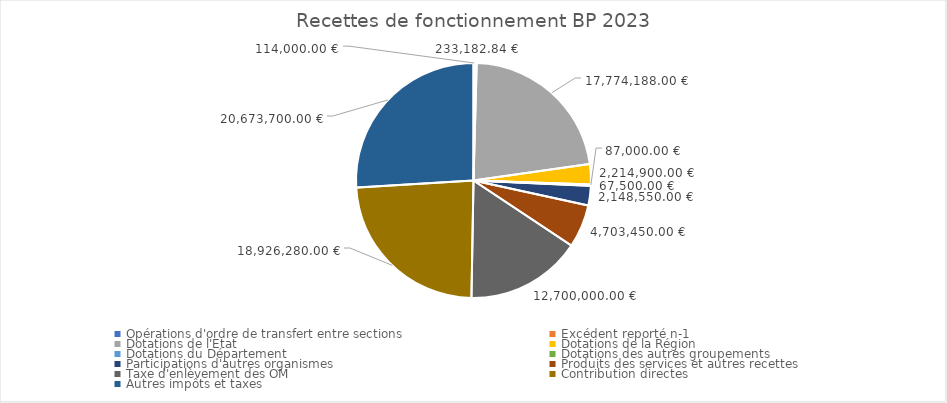
| Category | Series 0 | Series 1 |
|---|---|---|
| Opérations d'ordre de transfert entre sections | 114000 | 0.001 |
| Excédent reporté n-1 | 233182.84 | 0.003 |
| Dotations de l'Etat | 17774188 | 0.223 |
| Dotations de la Région | 2214900 | 0.028 |
| Dotations du Département | 87000 | 0.001 |
| Dotations des autres groupements | 67500 | 0.001 |
| Participations d'autres organismes | 2148550 | 0.027 |
| Produits des services et autres recettes | 4703450 | 0.059 |
| Taxe d'enlèvement des OM | 12700000 | 0.159 |
| Contribution directes | 18926280 | 0.238 |
| Autres impôts et taxes | 20673700 | 0.26 |